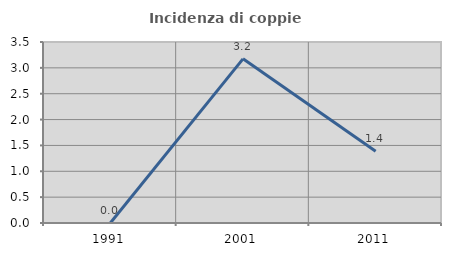
| Category | Incidenza di coppie miste |
|---|---|
| 1991.0 | 0 |
| 2001.0 | 3.175 |
| 2011.0 | 1.389 |